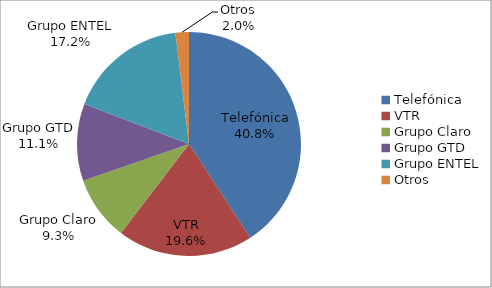
| Category | Series 0 |
|---|---|
| Telefónica | 1222434 |
| VTR | 587578 |
| Grupo Claro | 278804 |
| Grupo GTD | 333404 |
| Grupo ENTEL | 516733 |
| Otros | 58239 |